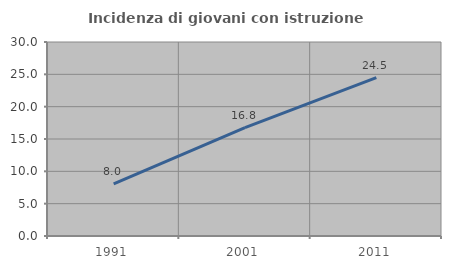
| Category | Incidenza di giovani con istruzione universitaria |
|---|---|
| 1991.0 | 8.046 |
| 2001.0 | 16.76 |
| 2011.0 | 24.481 |